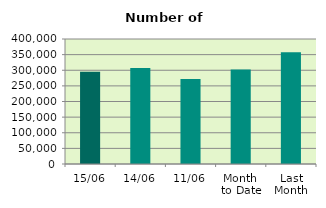
| Category | Series 0 |
|---|---|
| 15/06 | 295022 |
| 14/06 | 307012 |
| 11/06 | 272150 |
| Month 
to Date | 302256.364 |
| Last
Month | 357760.286 |